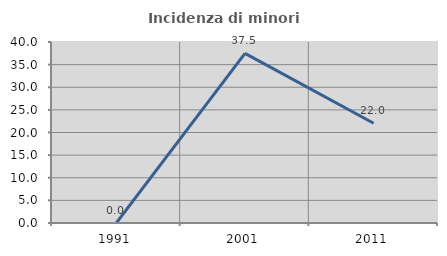
| Category | Incidenza di minori stranieri |
|---|---|
| 1991.0 | 0 |
| 2001.0 | 37.5 |
| 2011.0 | 22.034 |